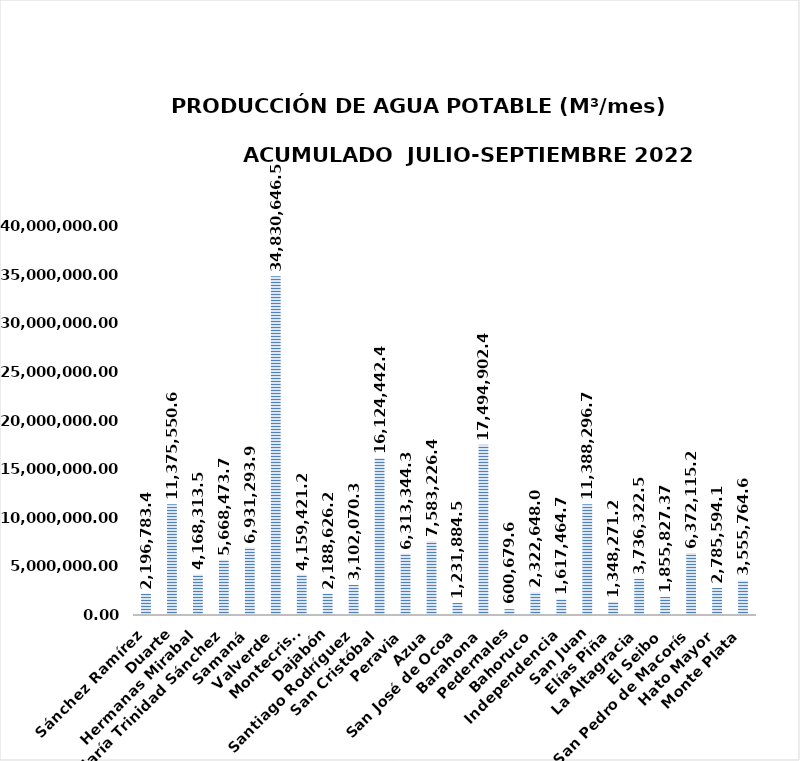
| Category | 2,196,783.47 |
|---|---|
| Sánchez Ramírez | 2196783.47 |
| Duarte | 11375550.674 |
| Hermanas Mirabal | 4168313.564 |
| María Trinidad Sánchez | 5668473.756 |
| Samaná | 6931293.988 |
| Valverde | 34830646.56 |
| Montecristi | 4159421.28 |
| Dajabón | 2188626.206 |
| Santiago Rodríguez | 3102070.314 |
| San Cristóbal | 16124442.417 |
| Peravia | 6313344.307 |
| Azua | 7583226.428 |
| San José de Ocoa | 1231884.58 |
| Barahona | 17494902.432 |
| Pedernales | 600679.68 |
| Bahoruco | 2322648 |
| Independencia | 1617464.738 |
| San Juan | 11388296.784 |
| Elías Piña | 1348271.204 |
| La Altagracia | 3736322.496 |
| El Seibo | 1855827.378 |
| San Pedro de Macorís | 6372115.2 |
| Hato Mayor | 2785594.176 |
| Monte Plata | 3555764.64 |